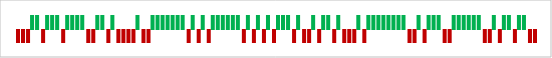
| Category | Win | Loss |
|---|---|---|
| 0 | 0 | -1 |
| 1 | 0 | -1 |
| 2 | 0 | -1 |
| 3 | 1 | 0 |
| 4 | 1 | 0 |
| 5 | 0 | -1 |
| 6 | 1 | 0 |
| 7 | 1 | 0 |
| 8 | 1 | 0 |
| 9 | 0 | -1 |
| 10 | 1 | 0 |
| 11 | 1 | 0 |
| 12 | 1 | 0 |
| 13 | 1 | 0 |
| 14 | 0 | -1 |
| 15 | 0 | -1 |
| 16 | 1 | 0 |
| 17 | 1 | 0 |
| 18 | 0 | -1 |
| 19 | 1 | 0 |
| 20 | 0 | -1 |
| 21 | 0 | -1 |
| 22 | 0 | -1 |
| 23 | 0 | -1 |
| 24 | 1 | 0 |
| 25 | 0 | -1 |
| 26 | 0 | -1 |
| 27 | 1 | 0 |
| 28 | 1 | 0 |
| 29 | 1 | 0 |
| 30 | 1 | 0 |
| 31 | 1 | 0 |
| 32 | 1 | 0 |
| 33 | 1 | 0 |
| 34 | 0 | -1 |
| 35 | 1 | 0 |
| 36 | 0 | -1 |
| 37 | 1 | 0 |
| 38 | 0 | -1 |
| 39 | 1 | 0 |
| 40 | 1 | 0 |
| 41 | 1 | 0 |
| 42 | 1 | 0 |
| 43 | 1 | 0 |
| 44 | 1 | 0 |
| 45 | 0 | -1 |
| 46 | 1 | 0 |
| 47 | 0 | -1 |
| 48 | 1 | 0 |
| 49 | 0 | -1 |
| 50 | 1 | 0 |
| 51 | 0 | -1 |
| 52 | 1 | 0 |
| 53 | 1 | 0 |
| 54 | 1 | 0 |
| 55 | 0 | -1 |
| 56 | 1 | 0 |
| 57 | 0 | -1 |
| 58 | 0 | -1 |
| 59 | 1 | 0 |
| 60 | 0 | -1 |
| 61 | 1 | 0 |
| 62 | 1 | 0 |
| 63 | 0 | -1 |
| 64 | 1 | 0 |
| 65 | 0 | -1 |
| 66 | 0 | -1 |
| 67 | 0 | -1 |
| 68 | 1 | 0 |
| 69 | 0 | -1 |
| 70 | 1 | 0 |
| 71 | 1 | 0 |
| 72 | 1 | 0 |
| 73 | 1 | 0 |
| 74 | 1 | 0 |
| 75 | 1 | 0 |
| 76 | 1 | 0 |
| 77 | 1 | 0 |
| 78 | 0 | -1 |
| 79 | 0 | -1 |
| 80 | 1 | 0 |
| 81 | 0 | -1 |
| 82 | 1 | 0 |
| 83 | 1 | 0 |
| 84 | 1 | 0 |
| 85 | 0 | -1 |
| 86 | 0 | -1 |
| 87 | 1 | 0 |
| 88 | 1 | 0 |
| 89 | 1 | 0 |
| 90 | 1 | 0 |
| 91 | 1 | 0 |
| 92 | 1 | 0 |
| 93 | 0 | -1 |
| 94 | 0 | -1 |
| 95 | 1 | 0 |
| 96 | 0 | -1 |
| 97 | 1 | 0 |
| 98 | 1 | 0 |
| 99 | 0 | -1 |
| 100 | 1 | 0 |
| 101 | 1 | 0 |
| 102 | 0 | -1 |
| 103 | 0 | -1 |